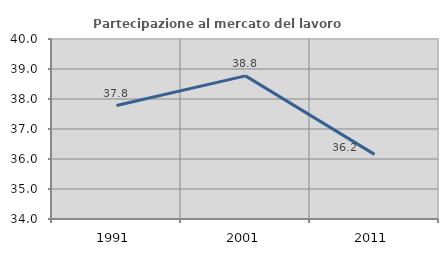
| Category | Partecipazione al mercato del lavoro  femminile |
|---|---|
| 1991.0 | 37.782 |
| 2001.0 | 38.77 |
| 2011.0 | 36.154 |